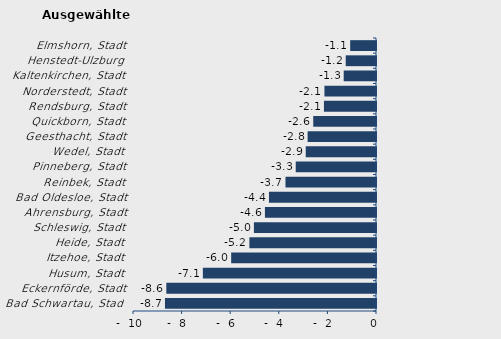
| Category | Überschuss der Geborenen (+) bzw. Gestorbenen (-) |
|---|---|
| Bad Schwartau, Stadt | -8.684 |
| Eckernförde, Stadt | -8.629 |
| Husum, Stadt | -7.125 |
| Itzehoe, Stadt | -5.96 |
| Heide, Stadt | -5.211 |
| Schleswig, Stadt | -5.025 |
| Ahrensburg, Stadt | -4.571 |
| Bad Oldesloe, Stadt | -4.405 |
| Reinbek, Stadt | -3.725 |
| Pinneberg, Stadt | -3.304 |
| Wedel, Stadt | -2.891 |
| Geesthacht, Stadt | -2.815 |
| Quickborn, Stadt | -2.583 |
| Rendsburg, Stadt | -2.143 |
| Norderstedt, Stadt | -2.122 |
| Kaltenkirchen, Stadt | -1.329 |
| Henstedt-Ulzburg | -1.247 |
| Elmshorn, Stadt | -1.062 |